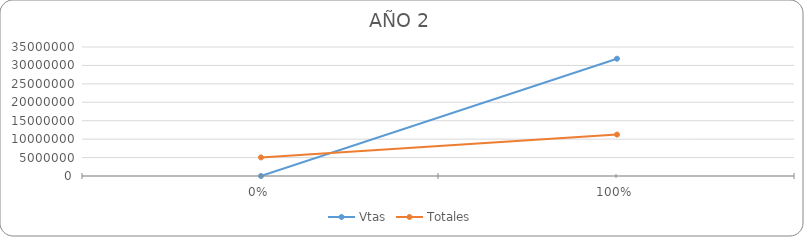
| Category | Vtas | Totales |
|---|---|---|
| 0.0 | 0 | 5036783.941 |
| 1.0 | 31823005.5 | 11238661.441 |